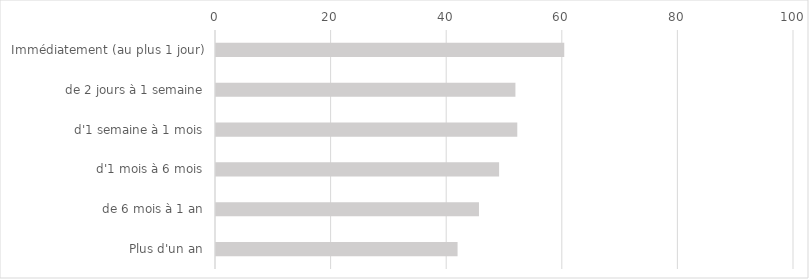
| Category | Series 0 |
|---|---|
| Immédiatement (au plus 1 jour) | 60.252 |
| de 2 jours à 1 semaine | 51.803 |
| d'1 semaine à 1 mois | 52.125 |
| d'1 mois à 6 mois | 48.978 |
| de 6 mois à 1 an | 45.497 |
| Plus d'un an | 41.794 |